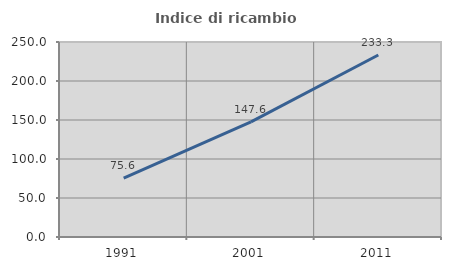
| Category | Indice di ricambio occupazionale  |
|---|---|
| 1991.0 | 75.556 |
| 2001.0 | 147.619 |
| 2011.0 | 233.333 |